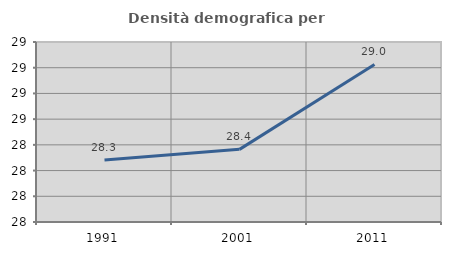
| Category | Densità demografica |
|---|---|
| 1991.0 | 28.282 |
| 2001.0 | 28.365 |
| 2011.0 | 29.026 |